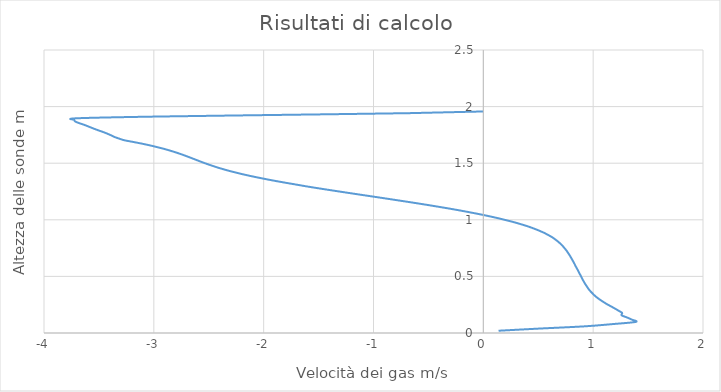
| Category | Height |
|---|---|
| 0.139 | 0.02 |
| 0.508 | 0.039 |
| 0.926 | 0.059 |
| 1.181 | 0.079 |
| 1.387 | 0.098 |
| 1.353 | 0.118 |
| 1.306 | 0.138 |
| 1.258 | 0.157 |
| 1.264 | 0.177 |
| 1.233 | 0.196 |
| 1.198 | 0.216 |
| 1.161 | 0.236 |
| 1.125 | 0.255 |
| 1.092 | 0.275 |
| 1.061 | 0.295 |
| 1.034 | 0.314 |
| 1.01 | 0.334 |
| 0.99 | 0.354 |
| 0.971 | 0.373 |
| 0.955 | 0.393 |
| 0.941 | 0.413 |
| 0.928 | 0.432 |
| 0.916 | 0.452 |
| 0.905 | 0.471 |
| 0.894 | 0.491 |
| 0.884 | 0.511 |
| 0.873 | 0.53 |
| 0.863 | 0.55 |
| 0.852 | 0.57 |
| 0.841 | 0.589 |
| 0.831 | 0.609 |
| 0.82 | 0.629 |
| 0.809 | 0.648 |
| 0.797 | 0.668 |
| 0.785 | 0.688 |
| 0.772 | 0.707 |
| 0.758 | 0.727 |
| 0.742 | 0.746 |
| 0.725 | 0.766 |
| 0.705 | 0.786 |
| 0.683 | 0.805 |
| 0.657 | 0.825 |
| 0.628 | 0.845 |
| 0.594 | 0.864 |
| 0.555 | 0.884 |
| 0.539 | 0.891 |
| 0.504 | 0.906 |
| 0.465 | 0.921 |
| 0.423 | 0.936 |
| 0.376 | 0.951 |
| 0.325 | 0.966 |
| 0.271 | 0.981 |
| 0.211 | 0.996 |
| 0.148 | 1.011 |
| 0.08 | 1.026 |
| 0.008 | 1.041 |
| -0.069 | 1.056 |
| -0.149 | 1.071 |
| -0.233 | 1.086 |
| -0.321 | 1.101 |
| -0.413 | 1.116 |
| -0.507 | 1.131 |
| -0.604 | 1.146 |
| -0.704 | 1.161 |
| -0.805 | 1.176 |
| -0.907 | 1.191 |
| -1.01 | 1.206 |
| -1.114 | 1.221 |
| -1.217 | 1.236 |
| -1.319 | 1.251 |
| -1.42 | 1.266 |
| -1.519 | 1.281 |
| -1.615 | 1.296 |
| -1.709 | 1.312 |
| -1.799 | 1.327 |
| -1.886 | 1.342 |
| -1.968 | 1.357 |
| -2.046 | 1.372 |
| -2.12 | 1.387 |
| -2.189 | 1.402 |
| -2.253 | 1.417 |
| -2.313 | 1.432 |
| -2.368 | 1.447 |
| -2.42 | 1.462 |
| -2.467 | 1.477 |
| -2.512 | 1.492 |
| -2.555 | 1.507 |
| -2.595 | 1.522 |
| -2.635 | 1.537 |
| -2.675 | 1.552 |
| -2.716 | 1.567 |
| -2.759 | 1.582 |
| -2.805 | 1.597 |
| -2.855 | 1.612 |
| -2.909 | 1.627 |
| -2.969 | 1.642 |
| -3.034 | 1.657 |
| -3.105 | 1.672 |
| -3.183 | 1.687 |
| -3.266 | 1.702 |
| -3.315 | 1.717 |
| -3.359 | 1.732 |
| -3.391 | 1.747 |
| -3.426 | 1.762 |
| -3.466 | 1.777 |
| -3.51 | 1.792 |
| -3.551 | 1.807 |
| -3.59 | 1.822 |
| -3.629 | 1.837 |
| -3.674 | 1.852 |
| -3.713 | 1.867 |
| -3.724 | 1.882 |
| -3.699 | 1.897 |
| -2.976 | 1.912 |
| -1.827 | 1.927 |
| -0.68 | 1.942 |
| 0.0 | 1.957 |